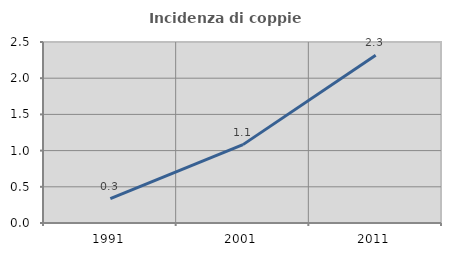
| Category | Incidenza di coppie miste |
|---|---|
| 1991.0 | 0.337 |
| 2001.0 | 1.083 |
| 2011.0 | 2.316 |